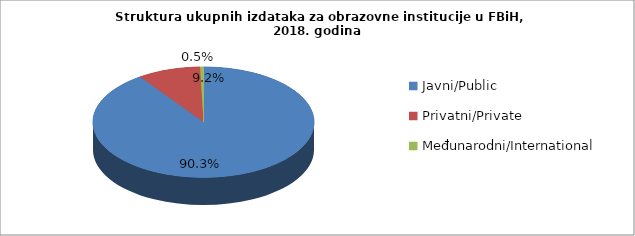
| Category | Series 0 |
|---|---|
| Javni/Public | 865584943 |
| Privatni/Private | 88324396 |
| Međunarodni/International | 4812379 |